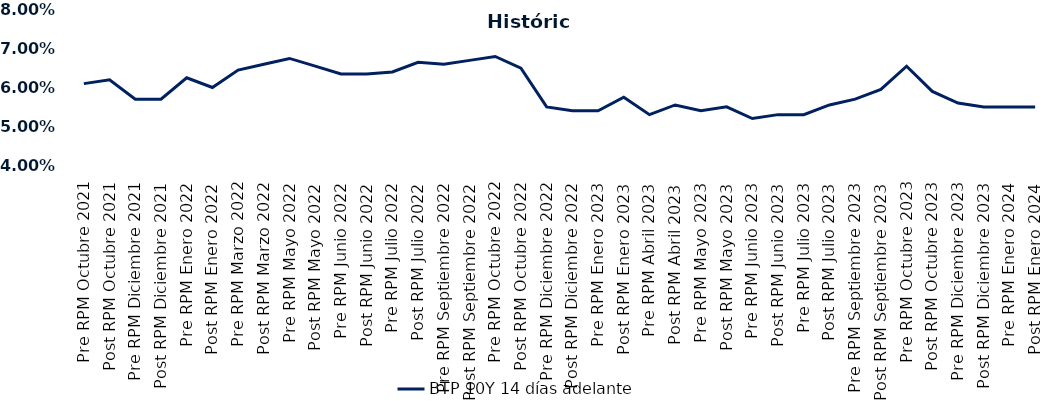
| Category | BTP 10Y 14 días adelante |
|---|---|
| Pre RPM Octubre 2021 | 0.061 |
| Post RPM Octubre 2021 | 0.062 |
| Pre RPM Diciembre 2021 | 0.057 |
| Post RPM Diciembre 2021 | 0.057 |
| Pre RPM Enero 2022 | 0.062 |
| Post RPM Enero 2022 | 0.06 |
| Pre RPM Marzo 2022 | 0.064 |
| Post RPM Marzo 2022 | 0.066 |
| Pre RPM Mayo 2022 | 0.068 |
| Post RPM Mayo 2022 | 0.066 |
| Pre RPM Junio 2022 | 0.064 |
| Post RPM Junio 2022 | 0.064 |
| Pre RPM Julio 2022 | 0.064 |
| Post RPM Julio 2022 | 0.066 |
| Pre RPM Septiembre 2022 | 0.066 |
| Post RPM Septiembre 2022 | 0.067 |
| Pre RPM Octubre 2022 | 0.068 |
| Post RPM Octubre 2022 | 0.065 |
| Pre RPM Diciembre 2022 | 0.055 |
| Post RPM Diciembre 2022 | 0.054 |
| Pre RPM Enero 2023 | 0.054 |
| Post RPM Enero 2023 | 0.058 |
| Pre RPM Abril 2023 | 0.053 |
| Post RPM Abril 2023 | 0.056 |
| Pre RPM Mayo 2023 | 0.054 |
| Post RPM Mayo 2023 | 0.055 |
| Pre RPM Junio 2023 | 0.052 |
| Post RPM Junio 2023 | 0.053 |
| Pre RPM Julio 2023 | 0.053 |
| Post RPM Julio 2023 | 0.056 |
| Pre RPM Septiembre 2023 | 0.057 |
| Post RPM Septiembre 2023 | 0.06 |
| Pre RPM Octubre 2023 | 0.066 |
| Post RPM Octubre 2023 | 0.059 |
| Pre RPM Diciembre 2023 | 0.056 |
| Post RPM Diciembre 2023 | 0.055 |
| Pre RPM Enero 2024 | 0.055 |
| Post RPM Enero 2024 | 0.055 |